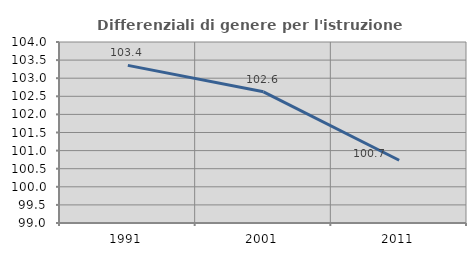
| Category | Differenziali di genere per l'istruzione superiore |
|---|---|
| 1991.0 | 103.355 |
| 2001.0 | 102.624 |
| 2011.0 | 100.733 |